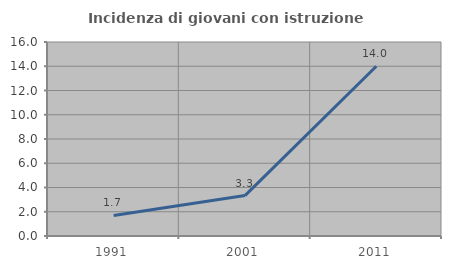
| Category | Incidenza di giovani con istruzione universitaria |
|---|---|
| 1991.0 | 1.695 |
| 2001.0 | 3.333 |
| 2011.0 | 14 |